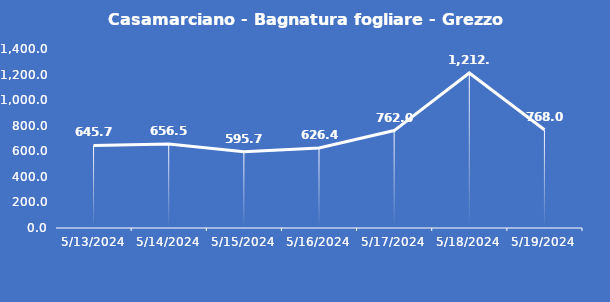
| Category | Casamarciano - Bagnatura fogliare - Grezzo (min) |
|---|---|
| 5/13/24 | 645.7 |
| 5/14/24 | 656.5 |
| 5/15/24 | 595.7 |
| 5/16/24 | 626.4 |
| 5/17/24 | 762 |
| 5/18/24 | 1212.7 |
| 5/19/24 | 768 |